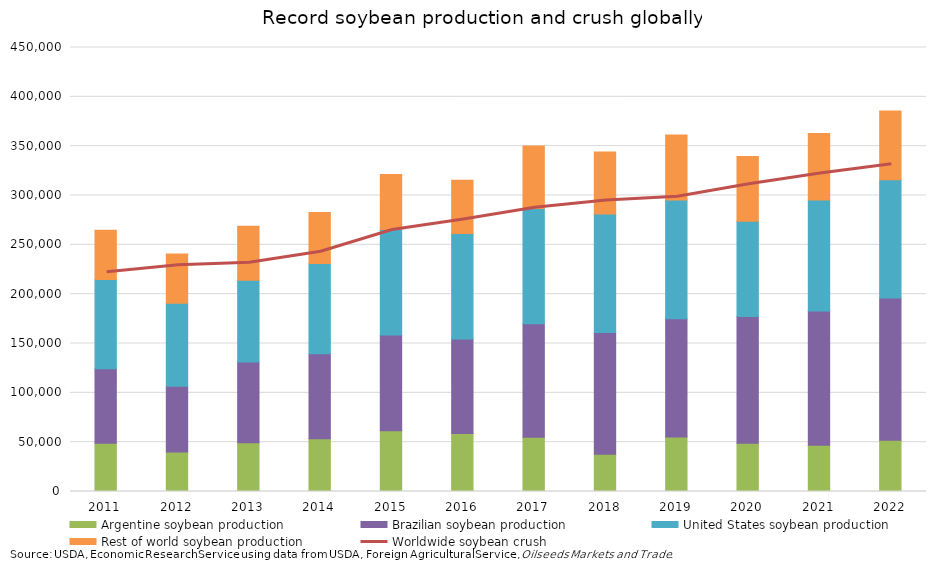
| Category | Argentine soybean production | Brazilian soybean production | United States soybean production | Rest of world soybean production |
|---|---|---|---|---|
| 2011.0 | 49000 | 75300 | 90663 | 49770 |
| 2012.0 | 40100 | 66500 | 84291 | 49941 |
| 2013.0 | 49300 | 82000 | 82791 | 54866 |
| 2014.0 | 53400 | 86200 | 91363 | 51736 |
| 2015.0 | 61450 | 97100 | 106905 | 55736 |
| 2016.0 | 58800 | 95700 | 106869 | 54050 |
| 2017.0 | 55000 | 114900 | 116931 | 63350 |
| 2018.0 | 37800 | 123400 | 120065 | 62917 |
| 2019.0 | 55300 | 119700 | 120515 | 65763 |
| 2020.0 | 48800 | 128500 | 96667 | 65452 |
| 2021.0 | 47000 | 136000 | 112549 | 67398 |
| 2022.0 | 52000 | 144000 | 119884 | 69641 |